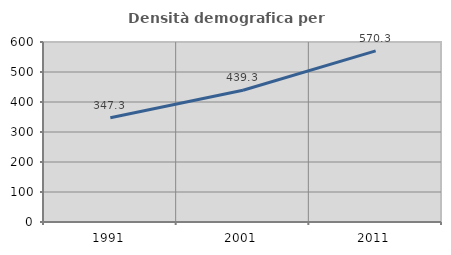
| Category | Densità demografica |
|---|---|
| 1991.0 | 347.273 |
| 2001.0 | 439.269 |
| 2011.0 | 570.342 |